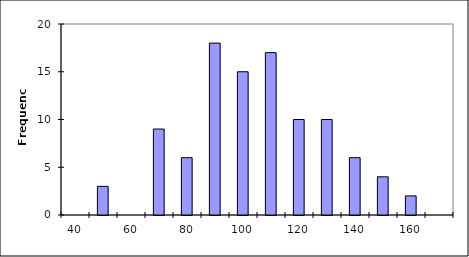
| Category | Frequency |
|---|---|
| 40 | 0 |
| 50 | 3 |
| 60 | 0 |
| 70 | 9 |
| 80 | 6 |
| 90 | 18 |
| 100 | 15 |
| 110 | 17 |
| 120 | 10 |
| 130 | 10 |
| 140 | 6 |
| 150 | 4 |
| 160 | 2 |
| More | 0 |